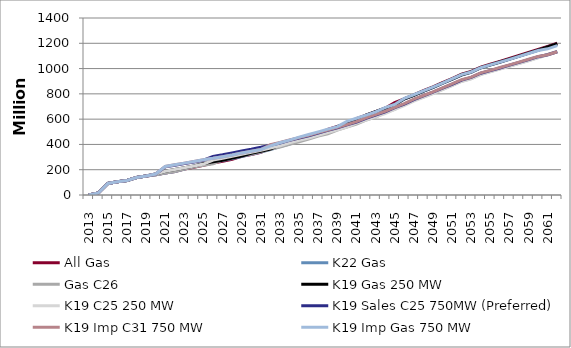
| Category | All Gas | K22 Gas | Gas C26 | K19 Gas 250 MW | K19 C25 250 MW | K19 Sales C25 750MW (Preferred) | K19 Imp C31 750 MW | K19 Imp Gas 750 MW |
|---|---|---|---|---|---|---|---|---|
| 2013.0 | 0 | 0 | 0 | 0 | 0 | 0 | 0 | 0 |
| 2014.0 | 16 | 16 | 16 | 16 | 16 | 16 | 16 | 16 |
| 2015.0 | 91 | 91 | 91 | 91 | 91 | 91 | 91 | 91 |
| 2016.0 | 104 | 104 | 104 | 104 | 104 | 104 | 104 | 104 |
| 2017.0 | 115 | 115 | 115 | 115 | 115 | 115 | 115 | 115 |
| 2018.0 | 138 | 138 | 138 | 138 | 138 | 138 | 138 | 138 |
| 2019.0 | 150 | 150 | 150 | 150 | 150 | 150 | 150 | 150 |
| 2020.0 | 161 | 161 | 161 | 166 | 166 | 166 | 166 | 166 |
| 2021.0 | 173 | 173 | 173 | 188 | 188 | 223 | 226 | 226 |
| 2022.0 | 186 | 186 | 186 | 201 | 201 | 235 | 239 | 239 |
| 2023.0 | 205 | 205 | 205 | 215 | 215 | 248 | 252 | 252 |
| 2024.0 | 220 | 230 | 221 | 229 | 230 | 261 | 265 | 265 |
| 2025.0 | 235 | 245 | 235 | 249 | 245 | 275 | 279 | 279 |
| 2026.0 | 253 | 258 | 247 | 262 | 276 | 305 | 290 | 290 |
| 2027.0 | 266 | 272 | 277 | 275 | 290 | 318 | 303 | 303 |
| 2028.0 | 282 | 288 | 294 | 292 | 306 | 333 | 317 | 317 |
| 2029.0 | 306 | 304 | 311 | 309 | 323 | 349 | 333 | 333 |
| 2030.0 | 321 | 323 | 325 | 330 | 337 | 362 | 346 | 346 |
| 2031.0 | 337 | 340 | 342 | 346 | 353 | 377 | 360 | 360 |
| 2032.0 | 370 | 359 | 361 | 363 | 372 | 394 | 398 | 389 |
| 2033.0 | 389 | 384 | 379 | 397 | 390 | 411 | 415 | 413 |
| 2034.0 | 412 | 403 | 400 | 419 | 412 | 432 | 435 | 434 |
| 2035.0 | 439 | 438 | 421 | 440 | 432 | 451 | 454 | 458 |
| 2036.0 | 461 | 460 | 442 | 460 | 451 | 469 | 473 | 478 |
| 2037.0 | 481 | 482 | 467 | 481 | 472 | 490 | 493 | 499 |
| 2038.0 | 518 | 503 | 484 | 502 | 494 | 511 | 514 | 521 |
| 2039.0 | 542 | 540 | 513 | 541 | 516 | 532 | 535 | 541 |
| 2040.0 | 565 | 565 | 537 | 566 | 538 | 555 | 557 | 582 |
| 2041.0 | 605 | 589 | 560 | 590 | 569 | 577 | 580 | 607 |
| 2042.0 | 632 | 630 | 592 | 632 | 593 | 607 | 611 | 632 |
| 2043.0 | 659 | 658 | 617 | 659 | 618 | 632 | 636 | 658 |
| 2044.0 | 686 | 686 | 651 | 687 | 643 | 658 | 661 | 691 |
| 2045.0 | 730 | 712 | 677 | 713 | 678 | 691 | 694 | 716 |
| 2046.0 | 761 | 758 | 715 | 761 | 706 | 719 | 722 | 764 |
| 2047.0 | 792 | 789 | 750 | 789 | 742 | 755 | 758 | 793 |
| 2048.0 | 826 | 820 | 774 | 822 | 772 | 785 | 787 | 824 |
| 2049.0 | 856 | 850 | 804 | 852 | 802 | 814 | 816 | 854 |
| 2050.0 | 888 | 882 | 835 | 884 | 833 | 845 | 847 | 885 |
| 2051.0 | 921 | 915 | 867 | 917 | 865 | 876 | 879 | 918 |
| 2052.0 | 955 | 949 | 900 | 951 | 898 | 909 | 912 | 952 |
| 2053.0 | 977 | 971 | 921 | 973 | 919 | 930 | 932 | 973 |
| 2054.0 | 1012 | 1006 | 955 | 1007 | 953 | 963 | 966 | 1007 |
| 2055.0 | 1034 | 1028 | 976 | 1029 | 974 | 984 | 986 | 1029 |
| 2056.0 | 1057 | 1050 | 998 | 1052 | 996 | 1005 | 1008 | 1051 |
| 2057.0 | 1080 | 1073 | 1019 | 1075 | 1017 | 1027 | 1029 | 1073 |
| 2058.0 | 1103 | 1096 | 1042 | 1098 | 1040 | 1049 | 1051 | 1096 |
| 2059.0 | 1127 | 1120 | 1064 | 1122 | 1062 | 1071 | 1074 | 1119 |
| 2060.0 | 1151 | 1144 | 1088 | 1146 | 1085 | 1094 | 1096 | 1143 |
| 2061.0 | 1176 | 1169 | 1111 | 1171 | 1109 | 1109 | 1109 | 1156 |
| 2062.0 | 1201 | 1194 | 1135 | 1196 | 1133 | 1133 | 1133 | 1181 |